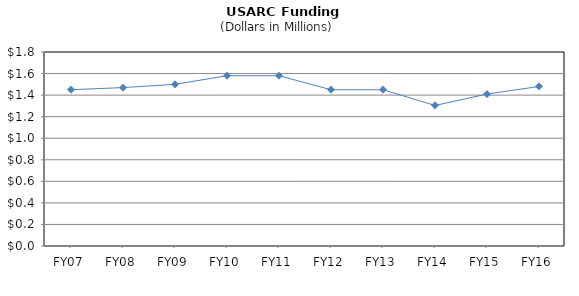
| Category | Series 0 |
|---|---|
| FY07 | 1.45 |
| FY08 | 1.47 |
| FY09 | 1.5 |
| FY10 | 1.58 |
| FY11 | 1.58 |
| FY12 | 1.45 |
| FY13 | 1.45 |
| FY14 | 1.304 |
| FY15 | 1.41 |
| FY16 | 1.48 |